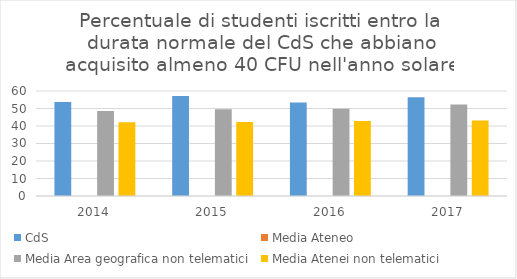
| Category | CdS | Media Ateneo | Media Area geografica non telematici | Media Atenei non telematici |
|---|---|---|---|---|
| 2014.0 | 53.7 |  | 48.6 | 42.2 |
| 2015.0 | 57.1 |  | 49.6 | 42.3 |
| 2016.0 | 53.4 |  | 49.8 | 42.8 |
| 2017.0 | 56.4 |  | 52.3 | 43.2 |